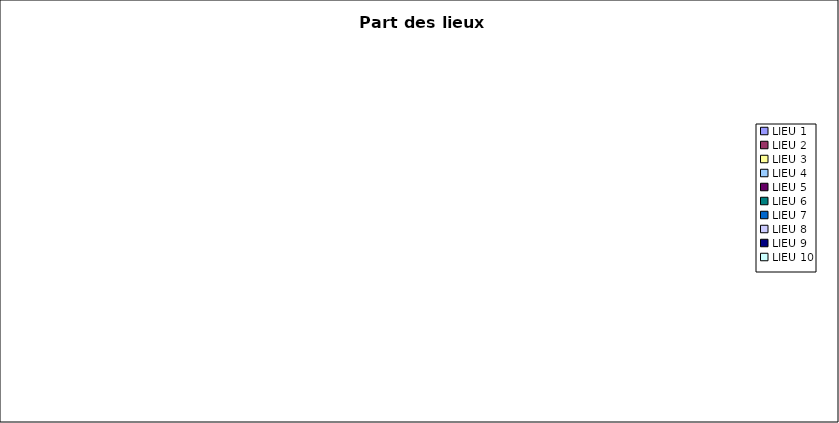
| Category | Part du lieu (%) |
|---|---|
| LIEU 1 | 0 |
| LIEU 2 | 0 |
| LIEU 3 | 0 |
| LIEU 4 | 0 |
| LIEU 5 | 0 |
| LIEU 6 | 0 |
| LIEU 7 | 0 |
| LIEU 8 | 0 |
| LIEU 9 | 0 |
| LIEU 10 | 0 |